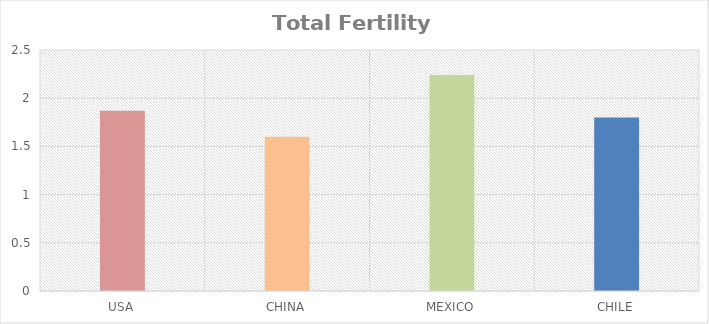
| Category | Series 0 |
|---|---|
| USA | 1.87 |
| CHINA | 1.6 |
| MEXICO | 2.24 |
| CHILE | 1.8 |